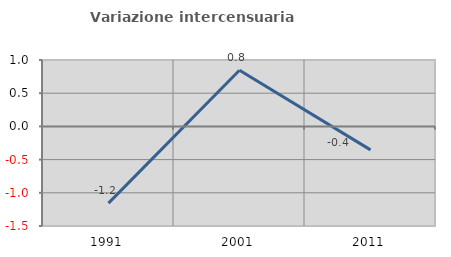
| Category | Variazione intercensuaria annua |
|---|---|
| 1991.0 | -1.155 |
| 2001.0 | 0.845 |
| 2011.0 | -0.353 |